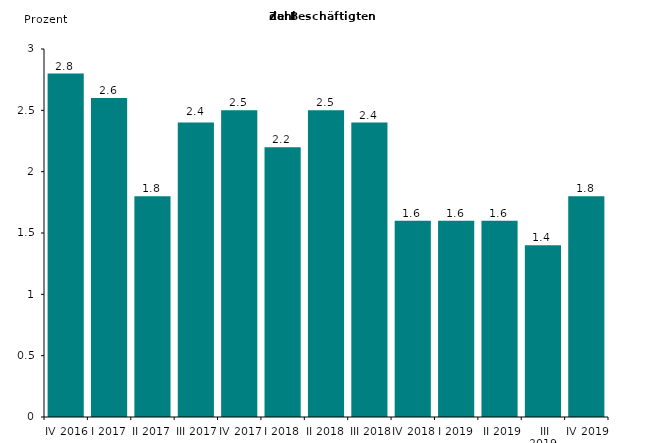
| Category | Series 0 |
|---|---|
| IV 2016 | 2.8 |
| I 2017 | 2.6 |
| II 2017 | 1.8 |
| III 2017 | 2.4 |
| IV 2017 | 2.5 |
| I 2018 | 2.2 |
| II 2018 | 2.5 |
| III 2018 | 2.4 |
| IV 2018 | 1.6 |
| I 2019 | 1.6 |
|  II 2019 | 1.6 |
|  III 2019 | 1.4 |
| IV 2019 | 1.8 |